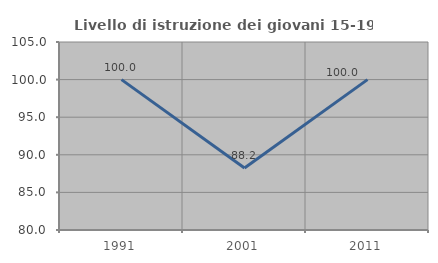
| Category | Livello di istruzione dei giovani 15-19 anni |
|---|---|
| 1991.0 | 100 |
| 2001.0 | 88.235 |
| 2011.0 | 100 |